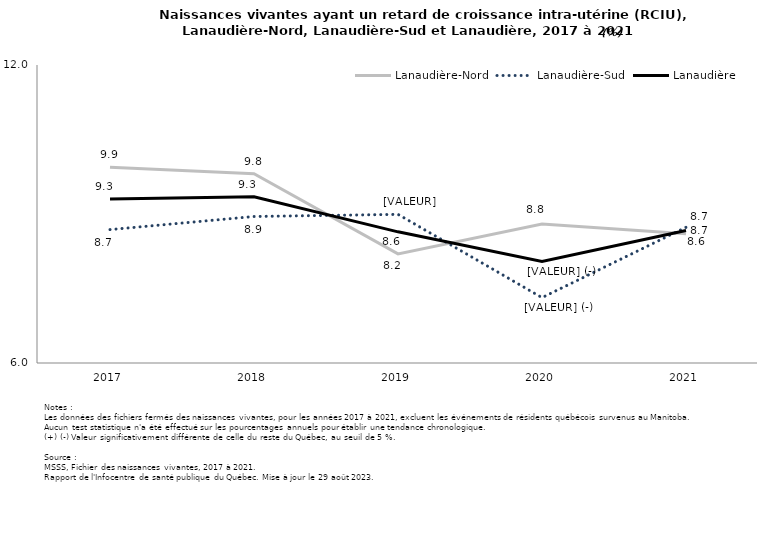
| Category | Lanaudière-Nord | Lanaudière-Sud | Lanaudière |
|---|---|---|---|
| 2017.0 | 9.94 | 8.686 | 9.3 |
| 2018.0 | 9.81 | 8.95 | 9.347 |
| 2019.0 | 8.197 | 8.993 | 8.641 |
| 2020.0 | 8.8 | 7.316 | 8.046 |
| 2021.0 | 8.6 | 8.732 | 8.669 |